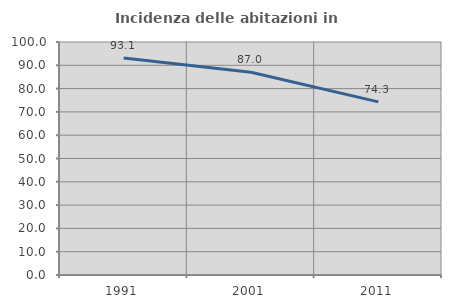
| Category | Incidenza delle abitazioni in proprietà  |
|---|---|
| 1991.0 | 93.143 |
| 2001.0 | 87.037 |
| 2011.0 | 74.314 |